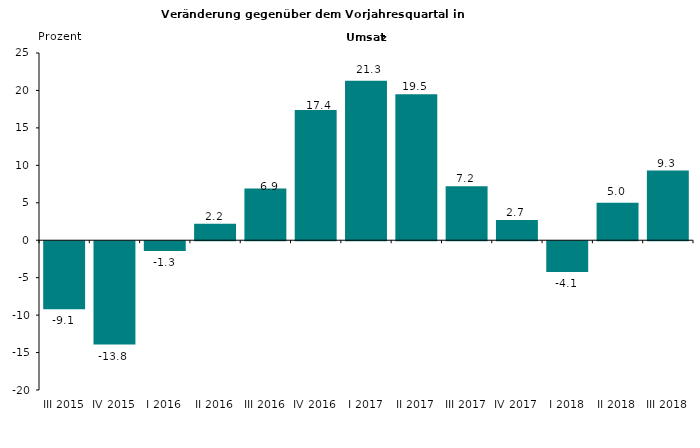
| Category | -9,1 -13,8 -1,3 2,2 6,9 17,4 21,3 19,5 7,2 2,7 -4,1 5,0 9,3 |
|---|---|
| III 2015 | -9.1 |
| IV 2015 | -13.8 |
| I 2016 | -1.3 |
| II 2016 | 2.2 |
| III 2016 | 6.9 |
| IV 2016 | 17.4 |
| I 2017 | 21.3 |
| II 2017 | 19.5 |
| III 2017 | 7.2 |
| IV 2017 | 2.7 |
| I 2018 | -4.1 |
| II 2018 | 5 |
| III 2018 | 9.3 |